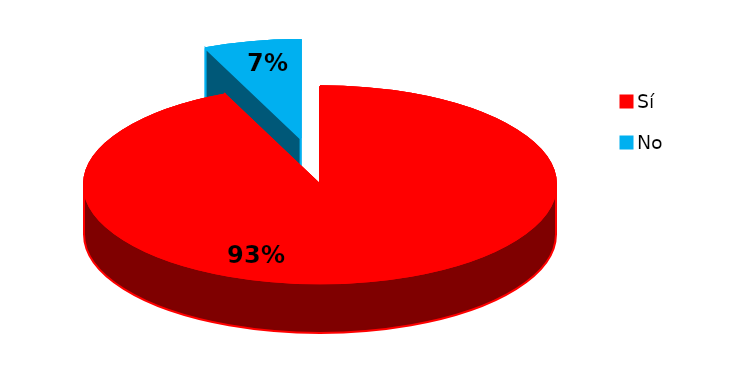
| Category | Series 0 |
|---|---|
| 0 | 85 |
| 1 | 6 |